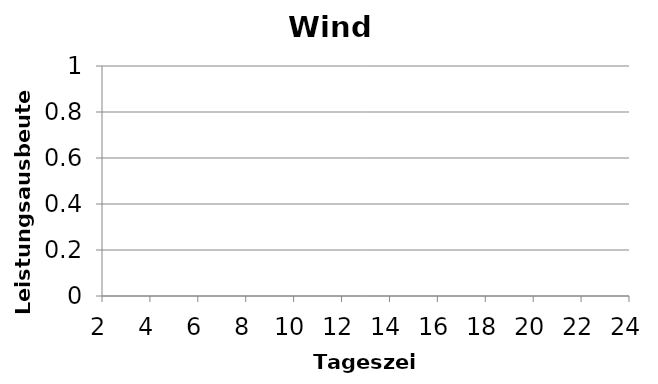
| Category | Series 0 |
|---|---|
| 2.0 | 0 |
| 4.0 | 0 |
| 6.0 | 0 |
| 8.0 | 0 |
| 10.0 | 0 |
| 12.0 | 0 |
| 14.0 | 0 |
| 16.0 | 0 |
| 18.0 | 0 |
| 20.0 | 0 |
| 22.0 | 0 |
| 24.0 | 0 |